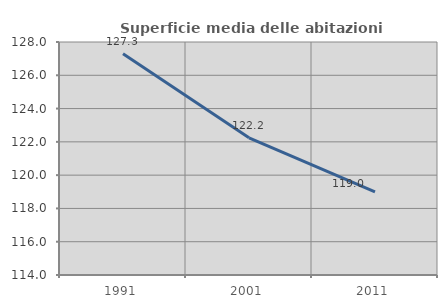
| Category | Superficie media delle abitazioni occupate |
|---|---|
| 1991.0 | 127.291 |
| 2001.0 | 122.242 |
| 2011.0 | 118.994 |